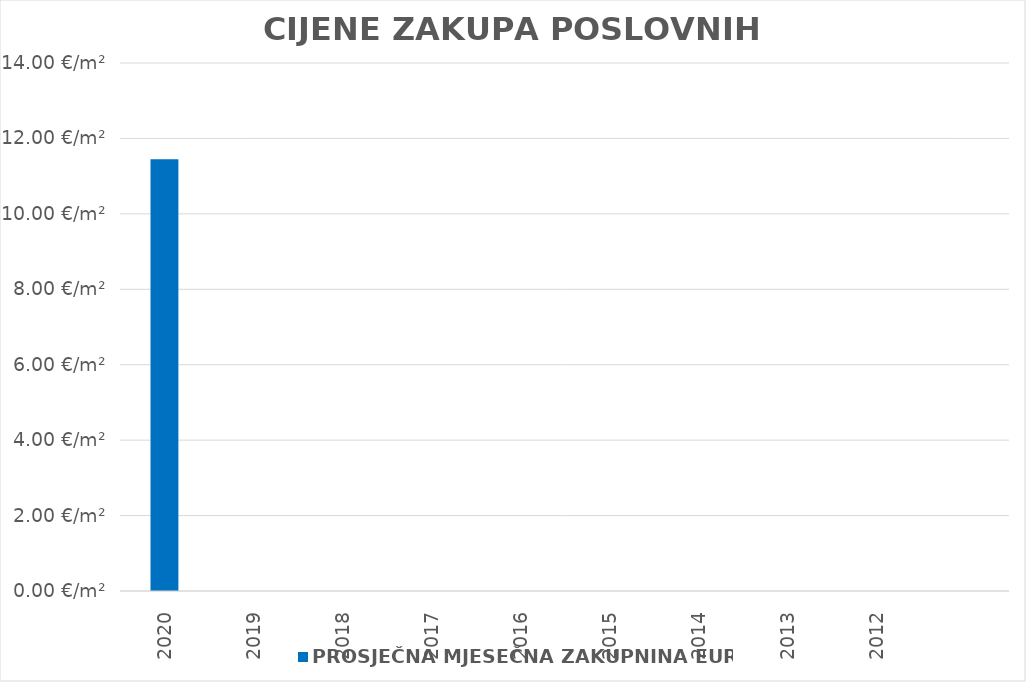
| Category | PROSJEČNA MJESEČNA ZAKUPNINA EUR/m2 |
|---|---|
| 2020 | 1900-01-11 10:42:01 |
| 2019 | 0 |
| 2018 | 0 |
| 2017 | 0 |
| 2016 | 0 |
| 2015 | 0 |
| 2014 | 0 |
| 2013 | 0 |
| 2012 | 0 |